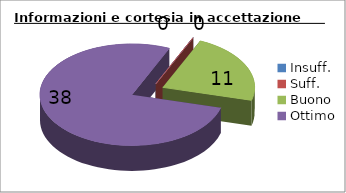
| Category | Informazioni e cortesia in accettazione |
|---|---|
| Insuff. | 0 |
| Suff. | 0 |
| Buono | 11 |
| Ottimo | 38 |